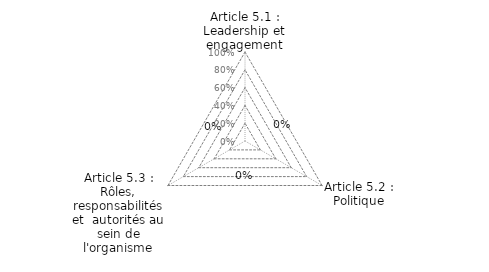
| Category | Article 5 : Leadership |
|---|---|
| Article 5.1 : Leadership et engagement | 0 |
| Article 5.2 : Politique | 0 |
| Article 5.3 : Rôles, responsabilités et  autorités au sein de l'organisme | 0 |